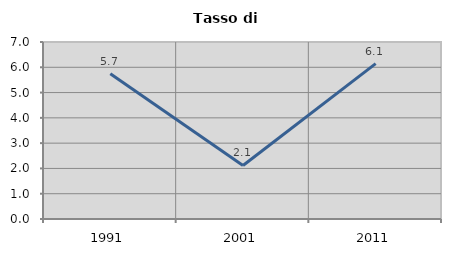
| Category | Tasso di disoccupazione   |
|---|---|
| 1991.0 | 5.748 |
| 2001.0 | 2.116 |
| 2011.0 | 6.144 |